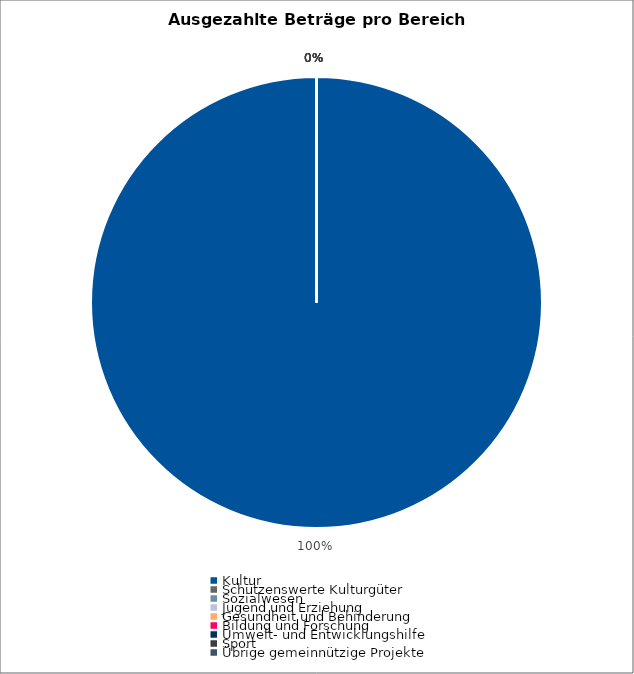
| Category | Series 0 |
|---|---|
| Kultur | 3017677 |
| Schützenswerte Kulturgüter | 0 |
| Sozialwesen | 0 |
| Jugend und Erziehung | 0 |
| Gesundheit und Behinderung | 0 |
| Bildung und Forschung | 0 |
| Umwelt- und Entwicklungshilfe | 0 |
| Sport | 0 |
| Übrige gemeinnützige Projekte | 0 |